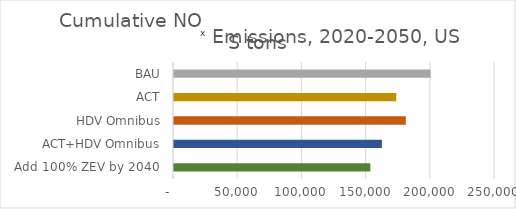
| Category | Cumulative NOx Emissions, 2020-2050, US tons |
|---|---|
|  Add 100% ZEV by 2040  | 152919.37 |
| ACT+HDV Omnibus | 161920 |
| HDV Omnibus | 180550 |
| ACT | 173110 |
| BAU | 199910 |